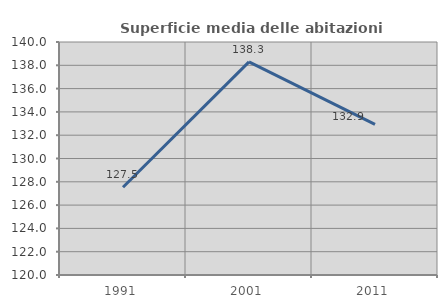
| Category | Superficie media delle abitazioni occupate |
|---|---|
| 1991.0 | 127.536 |
| 2001.0 | 138.29 |
| 2011.0 | 132.928 |